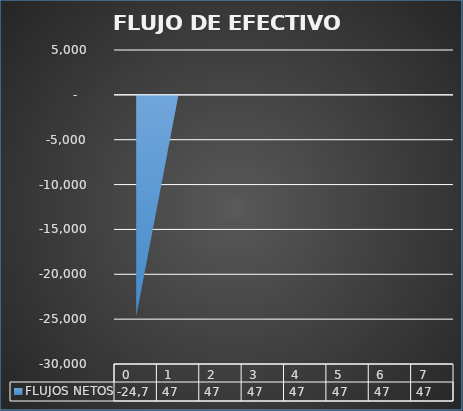
| Category | FLUJOS NETOS |
|---|---|
| 0.01 | -24700 |
| 1.0 | 46.6 |
| 2.0 | 46.6 |
| 3.0 | 46.6 |
| 4.0 | 46.6 |
| 5.0 | 46.6 |
| 6.0 | 46.6 |
| 7.0 | 46.6 |